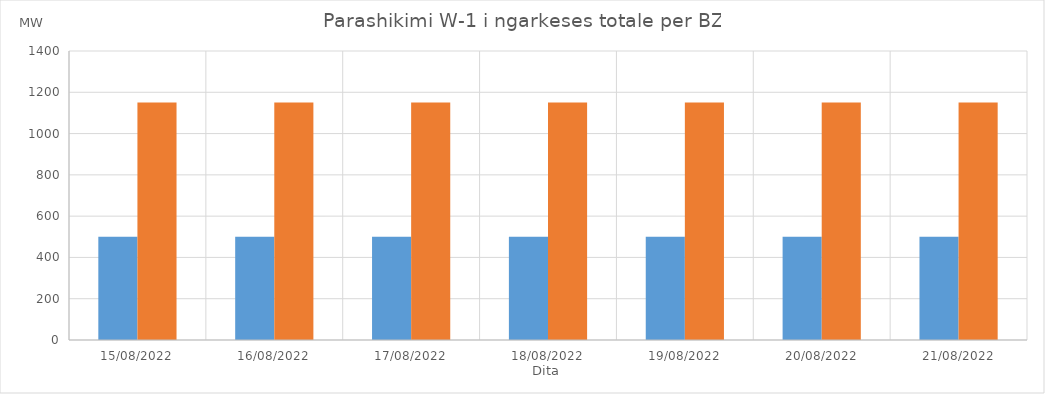
| Category | Min (MW) | Max (MW) |
|---|---|---|
| 15/08/2022 | 500 | 1150 |
| 16/08/2022 | 500 | 1150 |
| 17/08/2022 | 500 | 1150 |
| 18/08/2022 | 500 | 1150 |
| 19/08/2022 | 500 | 1150 |
| 20/08/2022 | 500 | 1150 |
| 21/08/2022 | 500 | 1150 |